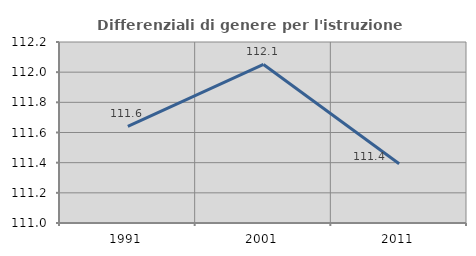
| Category | Differenziali di genere per l'istruzione superiore |
|---|---|
| 1991.0 | 111.641 |
| 2001.0 | 112.051 |
| 2011.0 | 111.393 |